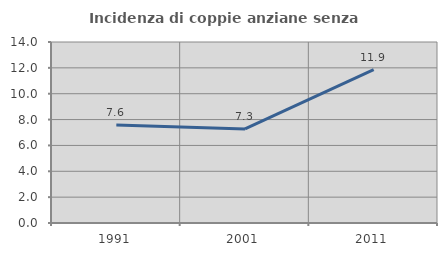
| Category | Incidenza di coppie anziane senza figli  |
|---|---|
| 1991.0 | 7.576 |
| 2001.0 | 7.28 |
| 2011.0 | 11.858 |